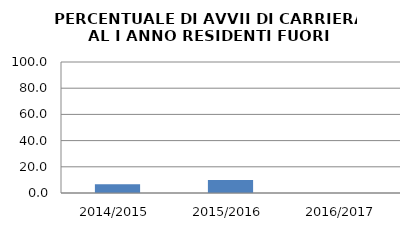
| Category | 2014/2015 2015/2016 2016/2017 |
|---|---|
| 2014/2015 | 6.667 |
| 2015/2016 | 10 |
| 2016/2017 | 0 |